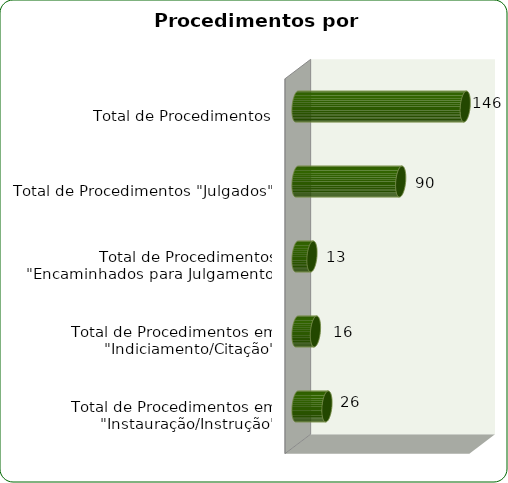
| Category | Série |
|---|---|
| Total de Procedimentos em "Instauração/Instrução" | 26 |
| Total de Procedimentos em "Indiciamento/Citação" | 16 |
| Total de Procedimentos "Encaminhados para Julgamento" | 13 |
| Total de Procedimentos "Julgados" | 90 |
| Total de Procedimentos | 146 |